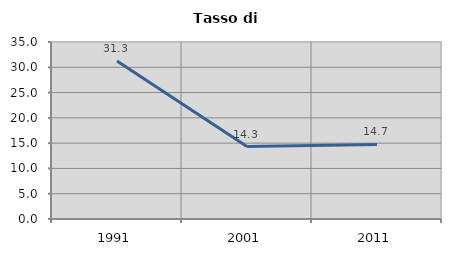
| Category | Tasso di disoccupazione   |
|---|---|
| 1991.0 | 31.257 |
| 2001.0 | 14.334 |
| 2011.0 | 14.749 |